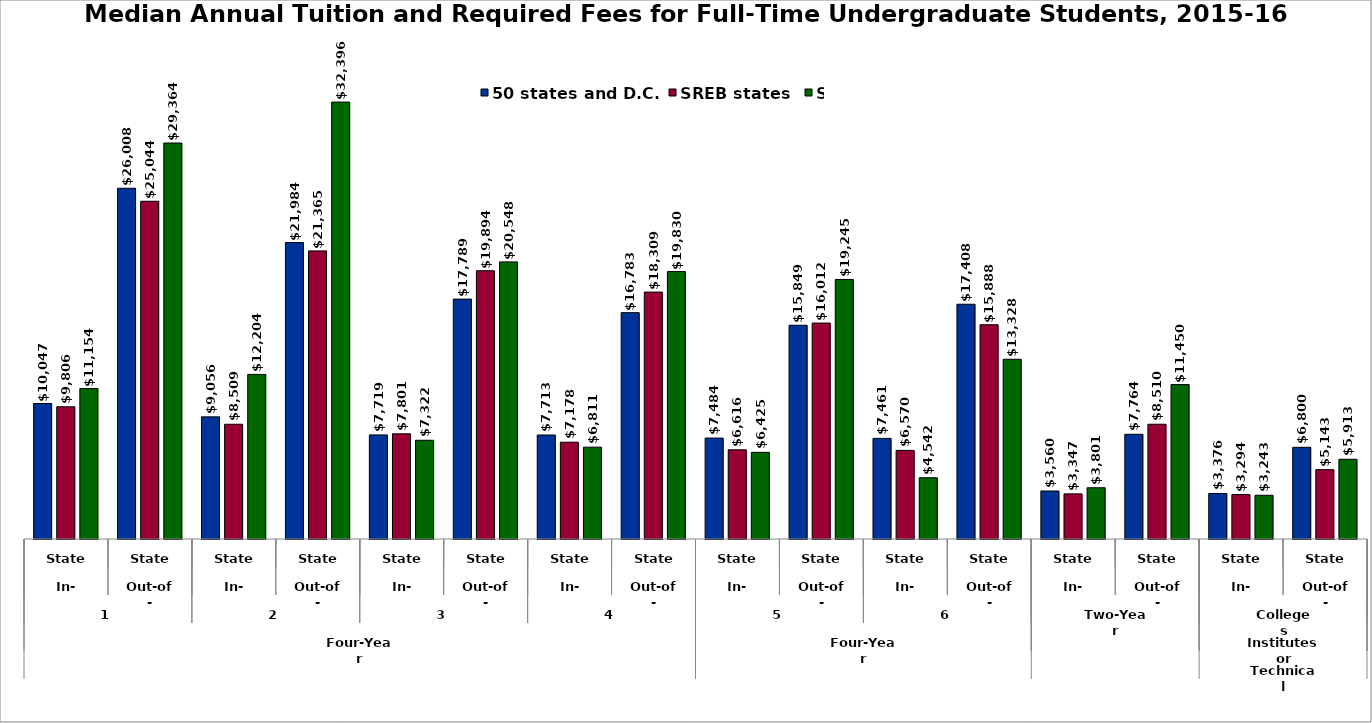
| Category | 50 states and D.C. | SREB states | State |
|---|---|---|---|
| 0 | 10047 | 9806 | 11154 |
| 1 | 26008 | 25044 | 29364 |
| 2 | 9056 | 8509 | 12204 |
| 3 | 21984 | 21365 | 32396 |
| 4 | 7719 | 7801 | 7322 |
| 5 | 17789 | 19894 | 20548 |
| 6 | 7713 | 7178 | 6811 |
| 7 | 16783 | 18309 | 19830 |
| 8 | 7484 | 6616 | 6425 |
| 9 | 15849 | 16012 | 19245 |
| 10 | 7461 | 6570 | 4542 |
| 11 | 17408 | 15888 | 13328 |
| 12 | 3560 | 3347 | 3801 |
| 13 | 7764 | 8510 | 11450 |
| 14 | 3376 | 3294 | 3243 |
| 15 | 6800 | 5142.5 | 5913 |